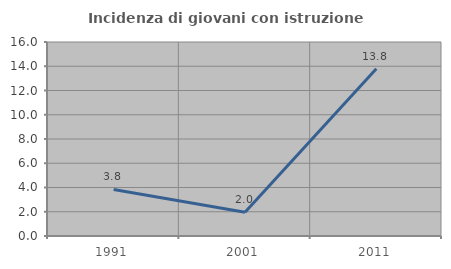
| Category | Incidenza di giovani con istruzione universitaria |
|---|---|
| 1991.0 | 3.836 |
| 2001.0 | 1.966 |
| 2011.0 | 13.793 |